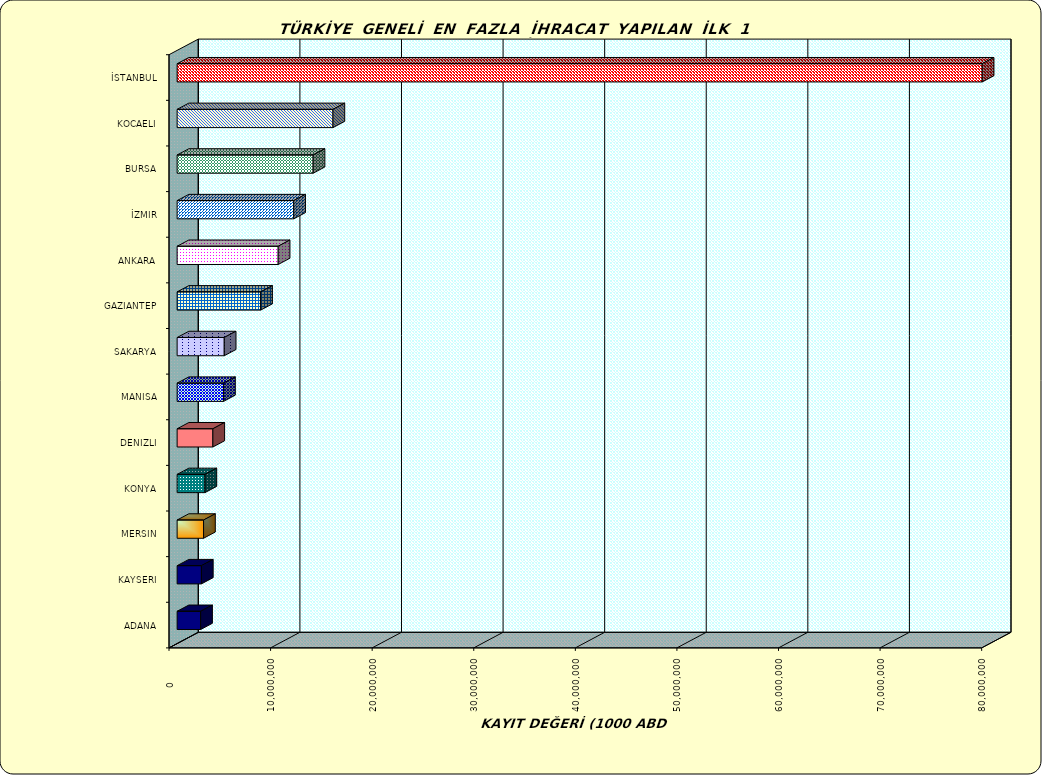
| Category | Series 0 |
|---|---|
| İSTANBUL | 79252495.808 |
| KOCAELI | 15341826.693 |
| BURSA | 13387236.676 |
| İZMIR | 11478237.752 |
| ANKARA | 9948309.052 |
| GAZIANTEP | 8223078.581 |
| SAKARYA | 4639473.053 |
| MANISA | 4573397.554 |
| DENIZLI | 3517495.059 |
| KONYA | 2739655.637 |
| MERSIN | 2602834.526 |
| KAYSERI | 2389181.674 |
| ADANA | 2315203.275 |